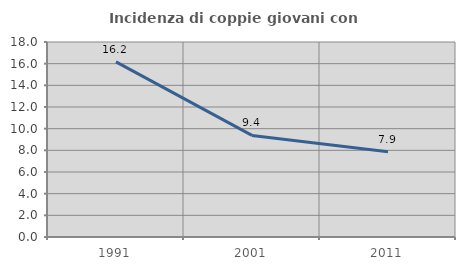
| Category | Incidenza di coppie giovani con figli |
|---|---|
| 1991.0 | 16.162 |
| 2001.0 | 9.375 |
| 2011.0 | 7.865 |